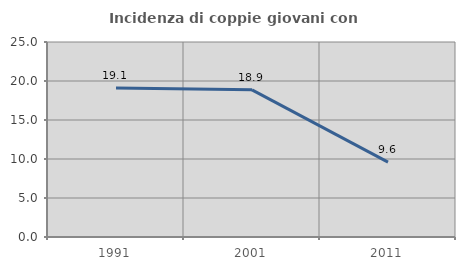
| Category | Incidenza di coppie giovani con figli |
|---|---|
| 1991.0 | 19.104 |
| 2001.0 | 18.872 |
| 2011.0 | 9.591 |